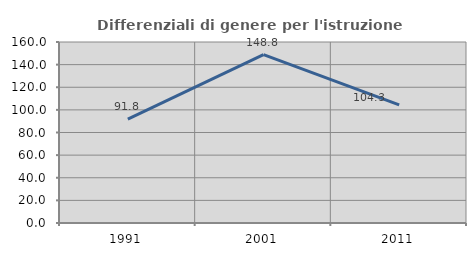
| Category | Differenziali di genere per l'istruzione superiore |
|---|---|
| 1991.0 | 91.818 |
| 2001.0 | 148.832 |
| 2011.0 | 104.348 |